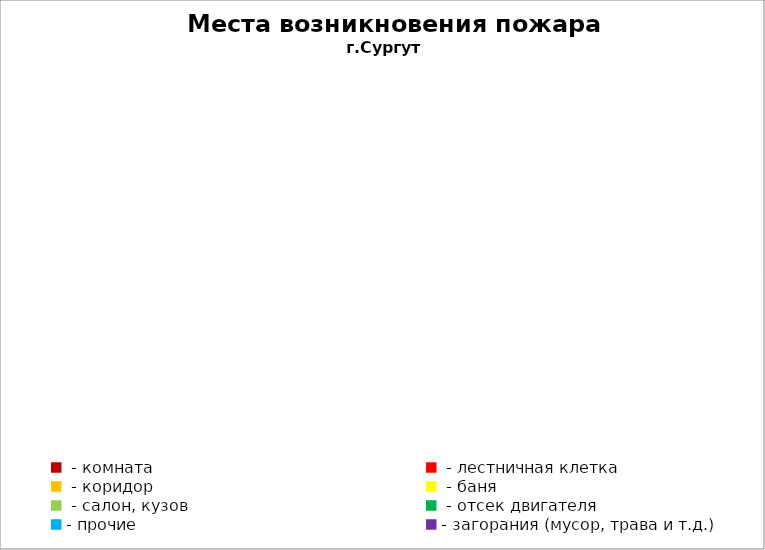
| Category | Места возникновения пожара |
|---|---|
|  - комната | 61 |
|  - лестничная клетка | 14 |
|  - коридор | 11 |
|  - баня | 36 |
|  - салон, кузов | 25 |
|  - отсек двигателя | 42 |
| - прочие | 93 |
| - загорания (мусор, трава и т.д.)  | 158 |